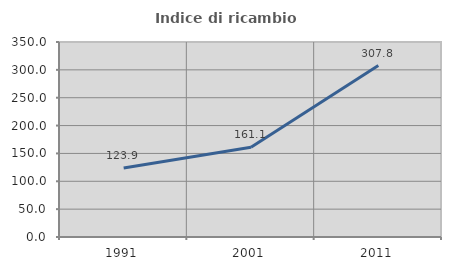
| Category | Indice di ricambio occupazionale  |
|---|---|
| 1991.0 | 123.864 |
| 2001.0 | 161.066 |
| 2011.0 | 307.767 |